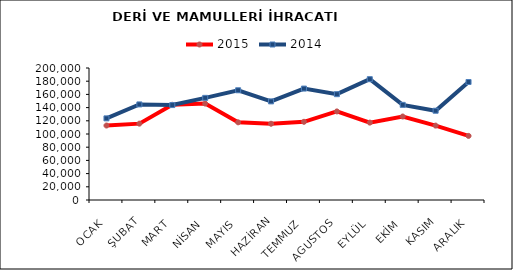
| Category | 2015 | 2014 |
|---|---|---|
| OCAK | 112829.994 | 123675.787 |
| ŞUBAT | 115694.829 | 144819.424 |
| MART | 144240.393 | 143824.895 |
| NİSAN | 146098.196 | 154749.456 |
| MAYIS | 117698.295 | 166261.823 |
| HAZİRAN | 115520.962 | 149417.126 |
| TEMMUZ | 118478.248 | 168805.083 |
| AGUSTOS | 134207.49 | 160336.712 |
| EYLÜL | 117245.681 | 183071.559 |
| EKİM | 126503.119 | 144130.106 |
| KASIM | 112719.645 | 135234.514 |
| ARALIK | 97109.33 | 178764.308 |